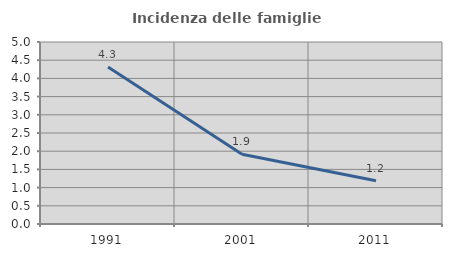
| Category | Incidenza delle famiglie numerose |
|---|---|
| 1991.0 | 4.311 |
| 2001.0 | 1.914 |
| 2011.0 | 1.187 |